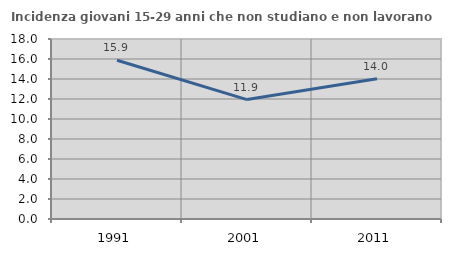
| Category | Incidenza giovani 15-29 anni che non studiano e non lavorano  |
|---|---|
| 1991.0 | 15.879 |
| 2001.0 | 11.94 |
| 2011.0 | 14.019 |